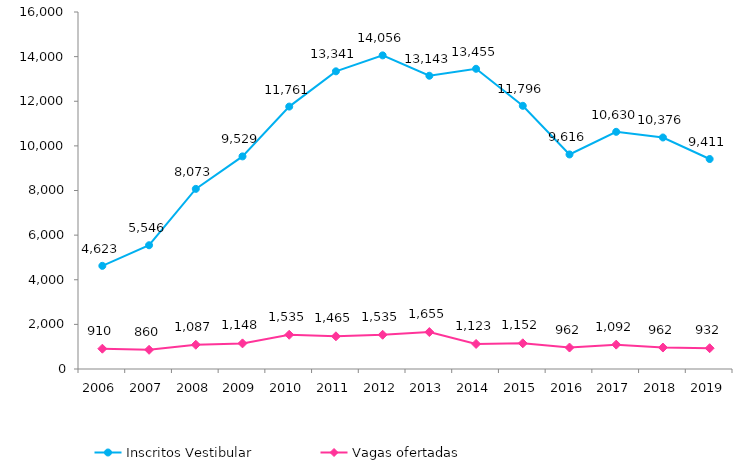
| Category | Inscritos Vestibular |
|---|---|
| 2006.0 | 4623 |
| 2007.0 | 5546 |
| 2008.0 | 8073 |
| 2009.0 | 9529 |
| 2010.0 | 11761 |
| 2011.0 | 13341 |
| 2012.0 | 14056 |
| 2013.0 | 13143 |
| 2014.0 | 13455 |
| 2015.0 | 11796 |
| 2016.0 | 9616 |
| 2017.0 | 10630 |
| 2018.0 | 10376 |
| 2019.0 | 9411 |